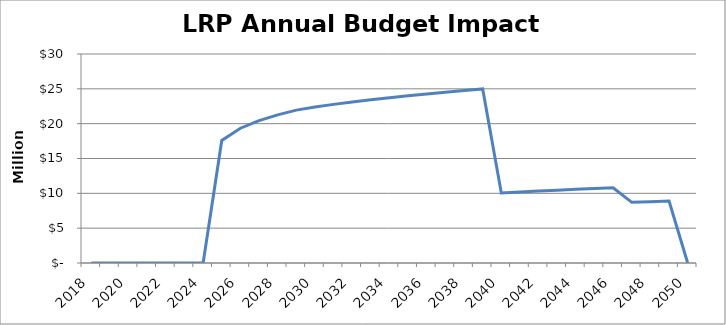
| Category | Series 0 |
|---|---|
| 2018.0 | 0 |
| 2019.0 | 0 |
| 2020.0 | 0 |
| 2021.0 | 0 |
| 2022.0 | 0 |
| 2023.0 | 0 |
| 2024.0 | 0 |
| 2025.0 | 17588065.363 |
| 2026.0 | 19345208.881 |
| 2027.0 | 20443530.378 |
| 2028.0 | 21268040.105 |
| 2029.0 | 21940672.22 |
| 2030.0 | 22402373.493 |
| 2031.0 | 22769778.108 |
| 2032.0 | 23106246.085 |
| 2033.0 | 23418864.107 |
| 2034.0 | 23712518.655 |
| 2035.0 | 23990725.374 |
| 2036.0 | 24256100.082 |
| 2037.0 | 24510642.894 |
| 2038.0 | 24755918.077 |
| 2039.0 | 24993172.532 |
| 2040.0 | 10063534.172 |
| 2041.0 | 10195895.919 |
| 2042.0 | 10324295.405 |
| 2043.0 | 10449147.852 |
| 2044.0 | 10570806.247 |
| 2045.0 | 10689573.22 |
| 2046.0 | 10805292.346 |
| 2047.0 | 8710304.096 |
| 2048.0 | 8808407.948 |
| 2049.0 | 8902586.339 |
| 2050.0 | 0 |